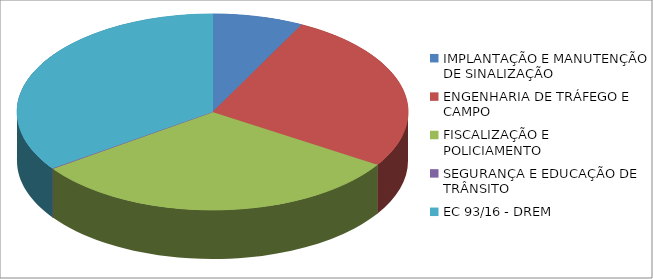
| Category | Series 0 | Series 1 |
|---|---|---|
| IMPLANTAÇÃO E MANUTENÇÃO DE SINALIZAÇÃO | 667252.01 |  |
| ENGENHARIA DE TRÁFEGO E CAMPO | 2357824.88 |  |
| FISCALIZAÇÃO E POLICIAMENTO | 2765169.34 |  |
| SEGURANÇA E EDUCAÇÃO DE TRÂNSITO | 7206.86 |  |
| EC 93/16 - DREM | 3088773.59 |  |